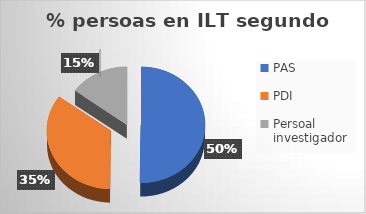
| Category | Series 0 |
|---|---|
| PAS | 224 |
| PDI | 155 |
| Persoal investigador | 67 |